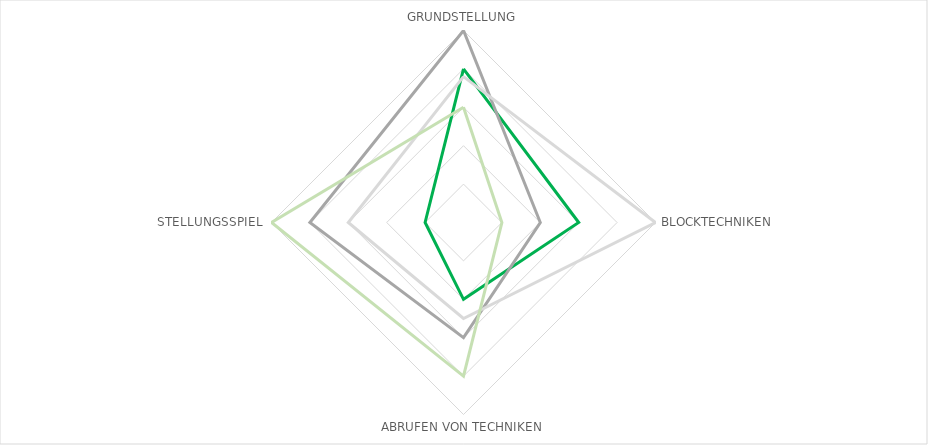
| Category | Series 0 | Series 1 | Series 2 | Series 3 |
|---|---|---|---|---|
| GRUNDSTELLUNG | 4 | 5 | 3.8 | 3 |
| BLOCKTECHNIKEN | 3 | 2 | 5 | 1 |
| ABRUFEN VON TECHNIKEN | 2 | 3 | 2.5 | 4 |
| STELLUNGSSPIEL | 1 | 4 | 3 | 5 |